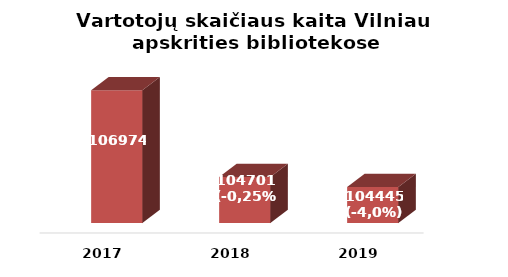
| Category | Series 0 |
|---|---|
| 2017.0 | 106974 |
| 2018.0 | 104701 |
| 2019.0 | 104445 |